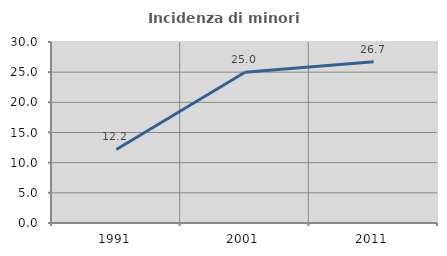
| Category | Incidenza di minori stranieri |
|---|---|
| 1991.0 | 12.195 |
| 2001.0 | 25 |
| 2011.0 | 26.726 |